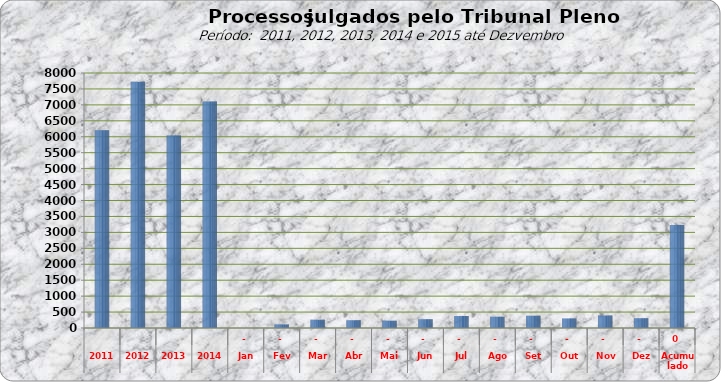
| Category | 6205 7722 6043  7.108  0 113 258 243 231 277 379 354 384 301 391 303 |
|---|---|
| 2011 | 6205 |
| 2012 | 7722 |
| 2013 | 6043 |
| 2014 | 7108 |
| Jan | 0 |
| Fev | 113 |
| Mar | 258 |
| Abr | 243 |
| Mai | 231 |
| Jun | 277 |
| Jul | 379 |
| Ago | 354 |
| Set | 384 |
| Out | 301 |
| Nov | 391 |
| Dez | 303 |
| Acumulado | 3234 |